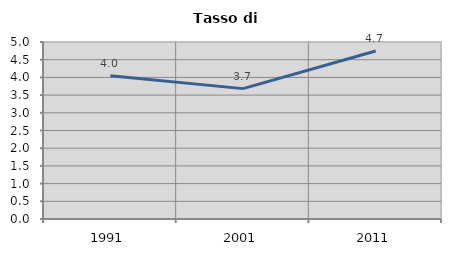
| Category | Tasso di disoccupazione   |
|---|---|
| 1991.0 | 4.045 |
| 2001.0 | 3.683 |
| 2011.0 | 4.744 |